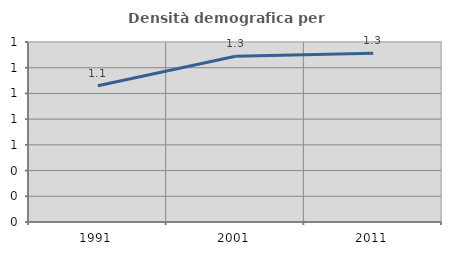
| Category | Densità demografica |
|---|---|
| 1991.0 | 1.059 |
| 2001.0 | 1.29 |
| 2011.0 | 1.313 |